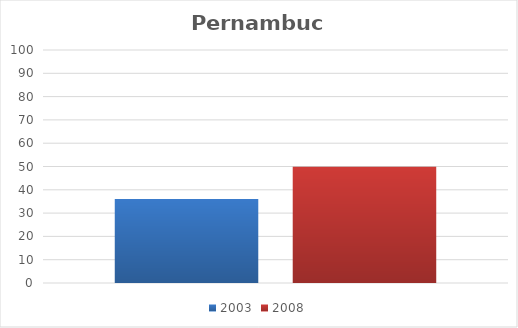
| Category | 2003 | 2008 |
|---|---|---|
| Total | 36.1 | 49.9 |